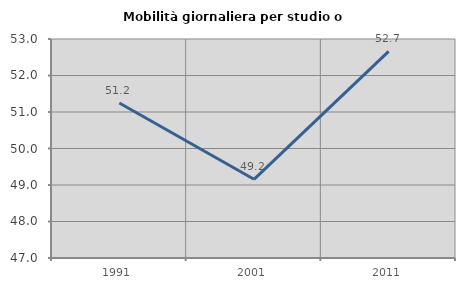
| Category | Mobilità giornaliera per studio o lavoro |
|---|---|
| 1991.0 | 51.246 |
| 2001.0 | 49.156 |
| 2011.0 | 52.659 |